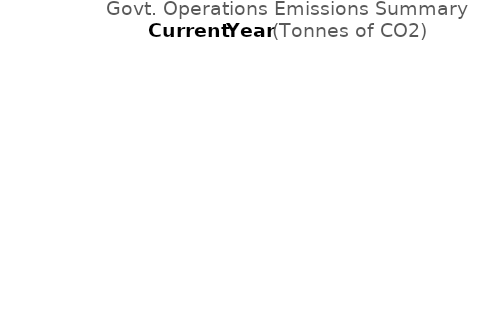
| Category | Series 0 |
|---|---|
| Buildings and Lighting | 0 |
| Govt. Fleet     | 0 |
| Water and Wastewater | 0 |
| Waste | 0 |